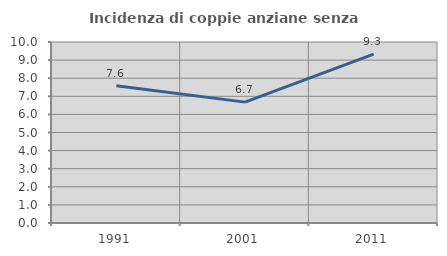
| Category | Incidenza di coppie anziane senza figli  |
|---|---|
| 1991.0 | 7.581 |
| 2001.0 | 6.678 |
| 2011.0 | 9.326 |